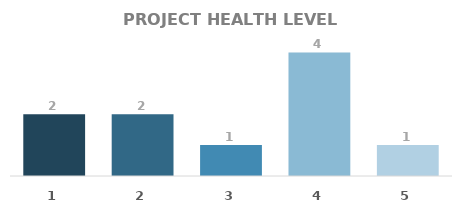
| Category | QTY |
|---|---|
| 1.0 | 2 |
| 2.0 | 2 |
| 3.0 | 1 |
| 4.0 | 4 |
| 5.0 | 1 |